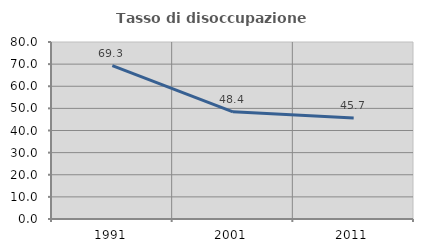
| Category | Tasso di disoccupazione giovanile  |
|---|---|
| 1991.0 | 69.297 |
| 2001.0 | 48.428 |
| 2011.0 | 45.677 |